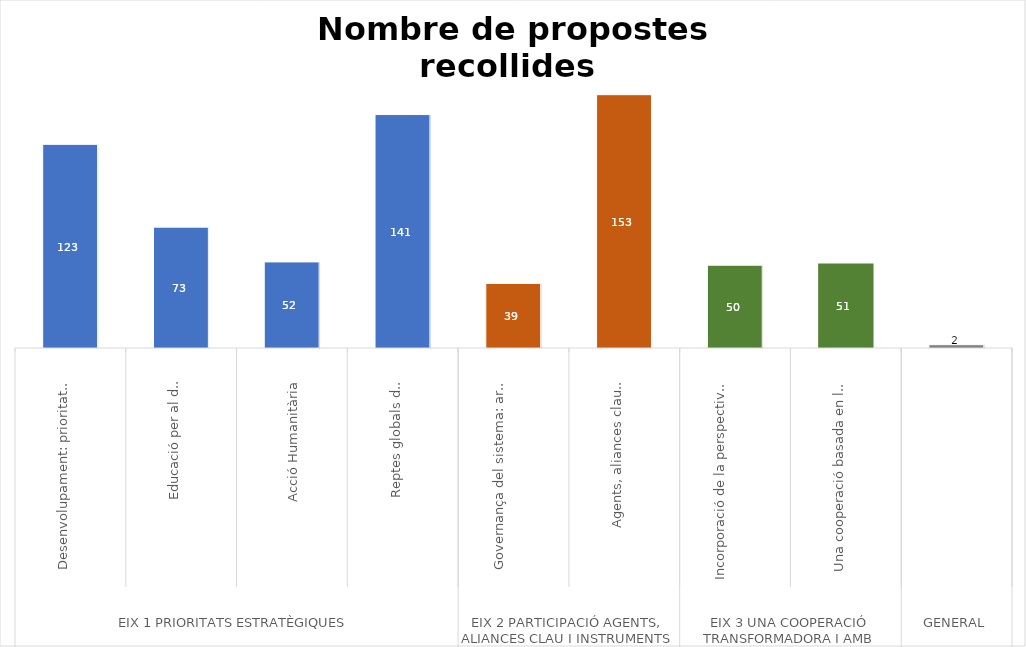
| Category | Series 0 |
|---|---|
| 0 | 123 |
| 1 | 73 |
| 2 | 52 |
| 3 | 141 |
| 4 | 39 |
| 5 | 153 |
| 6 | 50 |
| 7 | 51 |
| 8 | 2 |